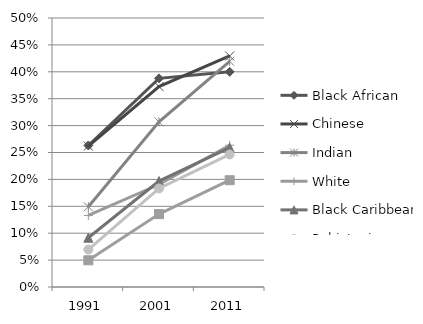
| Category | Black African | Chinese | Indian | White  | Black Caribbean | Pakistani | Bangladeshi |
|---|---|---|---|---|---|---|---|
| 1991.0 | 0.263 | 0.262 | 0.149 | 0.133 | 0.092 | 0.07 | 0.05 |
| 2001.0 | 0.388 | 0.373 | 0.307 | 0.191 | 0.197 | 0.183 | 0.135 |
| 2011.0 | 0.4 | 0.429 | 0.42 | 0.264 | 0.259 | 0.246 | 0.198 |